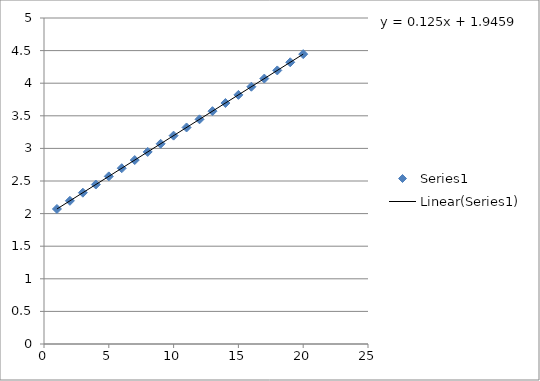
| Category | Series 0 |
|---|---|
| 1.0 | 2.071 |
| 2.0 | 2.196 |
| 3.0 | 2.321 |
| 4.0 | 2.446 |
| 5.0 | 2.571 |
| 6.0 | 2.696 |
| 7.0 | 2.821 |
| 8.0 | 2.946 |
| 9.0 | 3.071 |
| 10.0 | 3.196 |
| 11.0 | 3.321 |
| 12.0 | 3.446 |
| 13.0 | 3.571 |
| 14.0 | 3.696 |
| 15.0 | 3.821 |
| 16.0 | 3.946 |
| 17.0 | 4.071 |
| 18.0 | 4.196 |
| 19.0 | 4.321 |
| 20.0 | 4.446 |